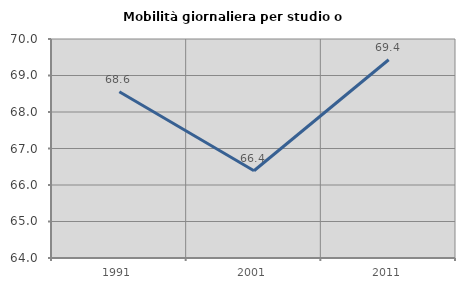
| Category | Mobilità giornaliera per studio o lavoro |
|---|---|
| 1991.0 | 68.553 |
| 2001.0 | 66.391 |
| 2011.0 | 69.431 |